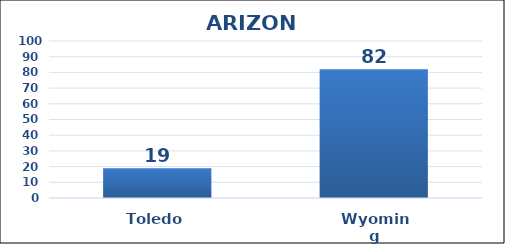
| Category | Series 0 |
|---|---|
| Toledo | 19 |
| Wyoming | 82 |